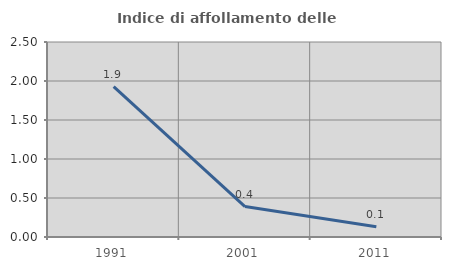
| Category | Indice di affollamento delle abitazioni  |
|---|---|
| 1991.0 | 1.928 |
| 2001.0 | 0.39 |
| 2011.0 | 0.131 |